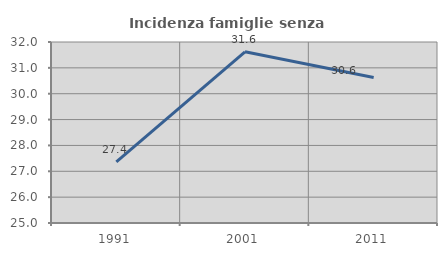
| Category | Incidenza famiglie senza nuclei |
|---|---|
| 1991.0 | 27.365 |
| 2001.0 | 31.622 |
| 2011.0 | 30.627 |